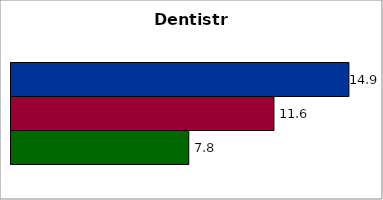
| Category | 50 states and D.C. | SREB states | State |
|---|---|---|---|
| 0 | 14.895 | 11.59 | 7.836 |